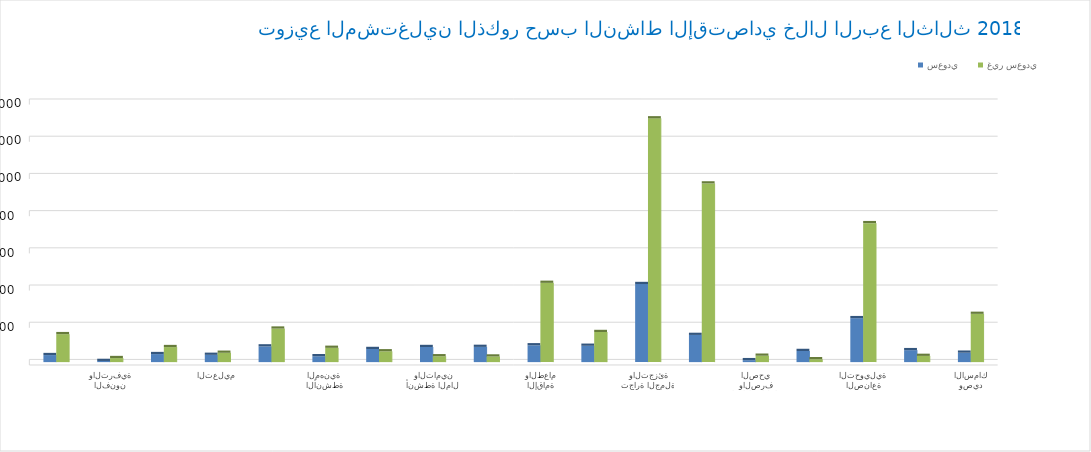
| Category | سعودي | غير سعودي |
|---|---|---|
| الزراعة والحراجة وصيد الأسماك | 50588 | 259414 |
| التعدين واستغلال المحاجر | 64223 | 33453 |
| الصناعة التحويلية | 236257 | 746915 |
| توصيل الكهرباء والغاز  | 59809 | 15416 |
| امدادات الماء والصرف الصحي | 10398 | 34349 |
| التشييد | 146151 | 960443 |
| تجارة الجملة والتجزئة | 419689 | 1310386 |
| النقل والتخزين | 87804 | 161814 |
| الإقامة والطعام | 90307 | 426128 |
| المعلومات والاتصالات | 81832 | 30136 |
| أنشطة المال والتأمين | 81108 | 31380 |
| الأنشطة العقارية | 70480 | 58048 |
| الأنشطة المهنية  | 31538 | 76776 |
| الخدمات الإدارية والدعم | 84369 | 180219 |
| التعليم | 39091 | 50184 |
| الصحة والعمل الاجتماعي | 43116 | 80752 |
| الفنون والترفية | 6211 | 21718 |
| الخدمات الأخرى | 37785 | 150281 |